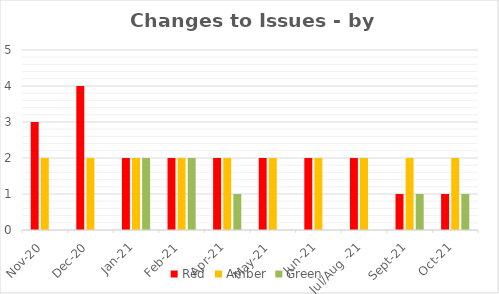
| Category | Red | Amber | Green |
|---|---|---|---|
| Nov-20 | 3 | 2 | 0 |
| Dec-20 | 4 | 2 | 0 |
| Jan-21 | 2 | 2 | 2 |
| Feb-21 | 2 | 2 | 2 |
| Apr-21 | 2 | 2 | 1 |
| May-21 | 2 | 2 | 0 |
| Jun-21 | 2 | 2 | 0 |
| Jul/Aug -21 | 2 | 2 | 0 |
| Sep-21 | 1 | 2 | 1 |
| Oct-21 | 1 | 2 | 1 |